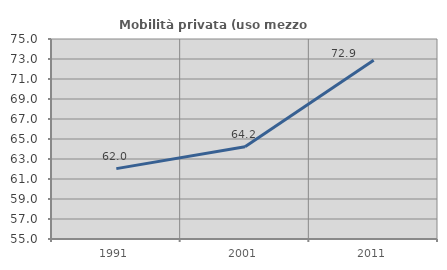
| Category | Mobilità privata (uso mezzo privato) |
|---|---|
| 1991.0 | 62.037 |
| 2001.0 | 64.217 |
| 2011.0 | 72.883 |